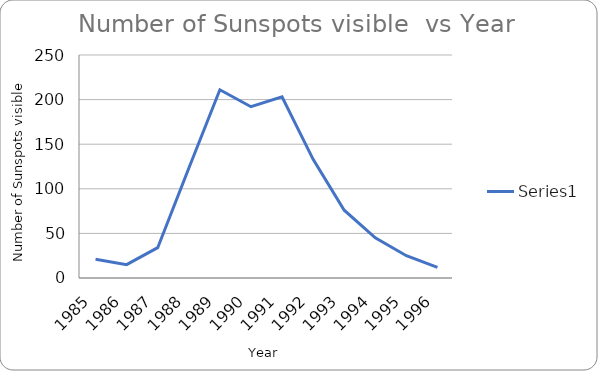
| Category | Series 0 |
|---|---|
| 1985.0 | 21 |
| 1986.0 | 15 |
| 1987.0 | 34 |
| 1988.0 | 123 |
| 1989.0 | 211 |
| 1990.0 | 192 |
| 1991.0 | 203 |
| 1992.0 | 133 |
| 1993.0 | 76 |
| 1994.0 | 45 |
| 1995.0 | 25 |
| 1996.0 | 12 |